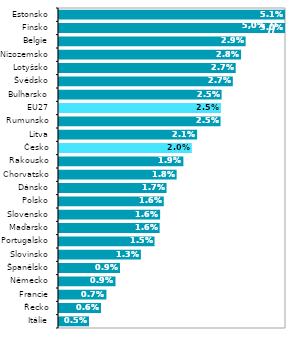
| Category | 2021* |
|---|---|
| Itálie | 0.005 |
| Řecko | 0.006 |
| Francie | 0.007 |
| Německo | 0.009 |
| Španělsko | 0.009 |
| Slovinsko | 0.013 |
| Portugalsko | 0.015 |
| Maďarsko | 0.016 |
| Slovensko | 0.016 |
| Polsko | 0.016 |
| Dánsko | 0.017 |
| Chorvatsko | 0.018 |
| Rakousko | 0.019 |
| Česko | 0.02 |
| Litva | 0.021 |
| Rumunsko | 0.025 |
| EU27 | 0.025 |
| Bulharsko | 0.025 |
| Švédsko | 0.027 |
| Lotyšsko | 0.027 |
| Nizozemsko | 0.028 |
| Belgie | 0.029 |
| Finsko | 0.05 |
| Estonsko | 0.051 |